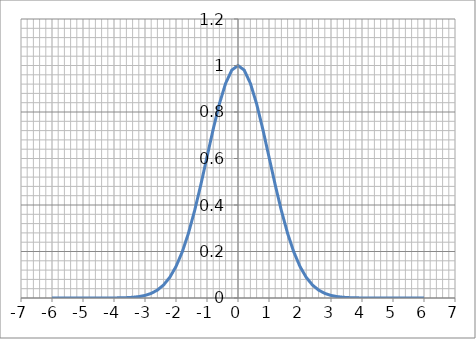
| Category | Series 0 |
|---|---|
| -6.0 | 0 |
| -5.8 | 0 |
| -5.6 | 0 |
| -5.4 | 0 |
| -5.2 | 0 |
| -5.0 | 0 |
| -4.8 | 0 |
| -4.6 | 0 |
| -4.4 | 0 |
| -4.2 | 0 |
| -4.0 | 0 |
| -3.8 | 0.001 |
| -3.6 | 0.002 |
| -3.4 | 0.003 |
| -3.2 | 0.006 |
| -3.0 | 0.011 |
| -2.8 | 0.02 |
| -2.6 | 0.034 |
| -2.4 | 0.056 |
| -2.2 | 0.089 |
| -2.0 | 0.135 |
| -1.8 | 0.198 |
| -1.6 | 0.278 |
| -1.4 | 0.375 |
| -1.2 | 0.487 |
| -1.0 | 0.607 |
| -0.8 | 0.726 |
| -0.6 | 0.835 |
| -0.4 | 0.923 |
| -0.19999999999999 | 0.98 |
| 0.0 | 1 |
| 0.20000000000001 | 0.98 |
| 0.40000000000001 | 0.923 |
| 0.60000000000001 | 0.835 |
| 0.80000000000001 | 0.726 |
| 1.00000000000001 | 0.607 |
| 1.20000000000001 | 0.487 |
| 1.40000000000001 | 0.375 |
| 1.60000000000001 | 0.278 |
| 1.80000000000001 | 0.198 |
| 2.00000000000001 | 0.135 |
| 2.20000000000001 | 0.089 |
| 2.40000000000001 | 0.056 |
| 2.60000000000001 | 0.034 |
| 2.80000000000001 | 0.02 |
| 3.00000000000001 | 0.011 |
| 3.20000000000001 | 0.006 |
| 3.40000000000001 | 0.003 |
| 3.60000000000001 | 0.002 |
| 3.80000000000001 | 0.001 |
| 4.0 | 0 |
| 4.2 | 0 |
| 4.4 | 0 |
| 4.6 | 0 |
| 4.8 | 0 |
| 5.0 | 0 |
| 5.2 | 0 |
| 5.4 | 0 |
| 5.6 | 0 |
| 5.8 | 0 |
| 6.0 | 0 |